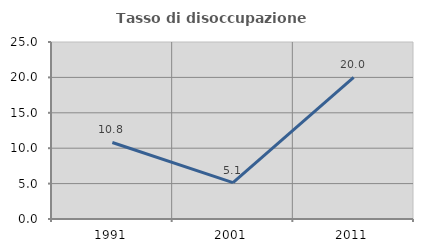
| Category | Tasso di disoccupazione giovanile  |
|---|---|
| 1991.0 | 10.811 |
| 2001.0 | 5.128 |
| 2011.0 | 20 |